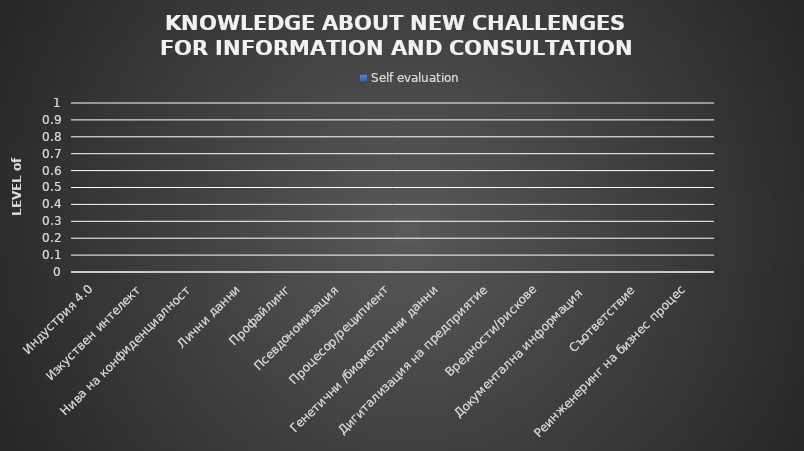
| Category | Self evaluation |
|---|---|
| Индустрия 4.0 | 0 |
| Изкуствен интелект | 0 |
| Нива на конфиденциалност | 0 |
| Лични данни | 0 |
| Профайлинг | 0 |
| Псевдономизация | 0 |
| Процесор/реципиент | 0 |
| Генетични /биометрични данни | 0 |
| Дигитализация на предприятие | 0 |
| Вредности/рискове | 0 |
| Документална информация  | 0 |
| Съответствие | 0 |
| Реинженеринг на бизнес процес | 0 |